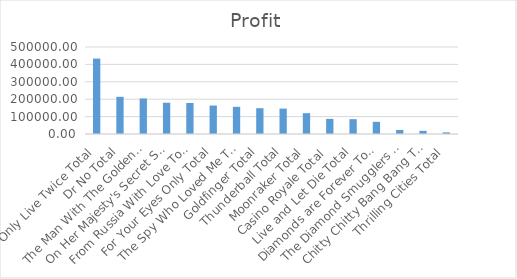
| Category | Profit |
|---|---|
| You Only Live Twice Total | 433461.65 |
| Dr No Total | 213738.69 |
| The Man With The Golden Gun Total | 204172.72 |
| On Her Majesty's Secret Service Total | 179726.84 |
| From Russia With Love Total | 178250.06 |
| For Your Eyes Only Total | 163628.3 |
| The Spy Who Loved Me Total | 156209.34 |
| Goldfinger Total | 148385.39 |
| Thunderball Total | 146000.39 |
| Moonraker Total | 119696.95 |
| Casino Royale Total | 86940.23 |
| Live and Let Die Total | 85168 |
| Diamonds are Forever Total | 69958.91 |
| The Diamond Smugglers Total | 23211.66 |
| Chitty Chitty Bang Bang Total | 18228.73 |
| Thrilling Cities Total | 9410.58 |